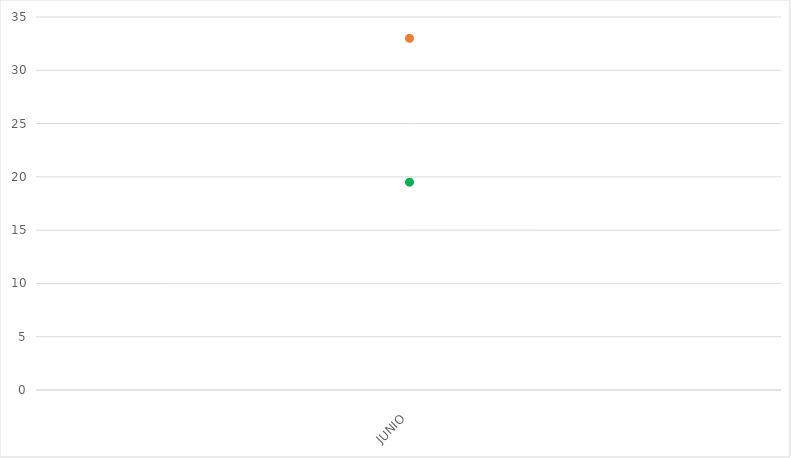
| Category | VALOR  | META PONDERADA |
|---|---|---|
| JUNIO | 33 | 19.5 |